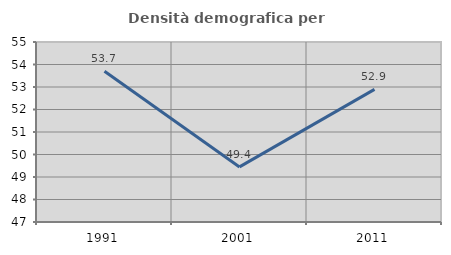
| Category | Densità demografica |
|---|---|
| 1991.0 | 53.704 |
| 2001.0 | 49.448 |
| 2011.0 | 52.893 |